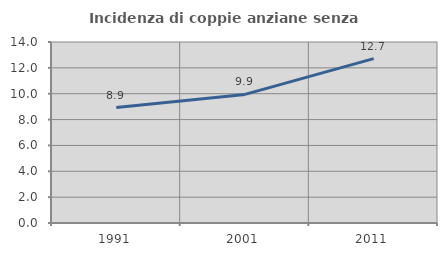
| Category | Incidenza di coppie anziane senza figli  |
|---|---|
| 1991.0 | 8.929 |
| 2001.0 | 9.945 |
| 2011.0 | 12.717 |